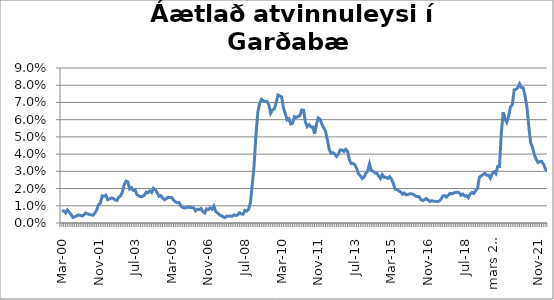
| Category | Series 0 |
|---|---|
| mar.00 | 0.007 |
| apr.00 | 0.007 |
| maí.00 | 0.006 |
| jún.00 | 0.008 |
| júl.00 | 0.006 |
| ágú.00 | 0.005 |
| sep.00 | 0.003 |
| okt.00 | 0.004 |
| nóv.00 | 0.004 |
| des.00 | 0.005 |
| jan.01 | 0.004 |
| feb.01 | 0.004 |
| mar.01 | 0.005 |
| apr.01 | 0.006 |
| maí.01 | 0.005 |
| jún.01 | 0.005 |
| júl.01 | 0.005 |
| ágú.01 | 0.005 |
| sep.01 | 0.006 |
| okt.01 | 0.008 |
| nóv.01 | 0.011 |
| des.01 | 0.011 |
| jan.02 | 0.016 |
| feb.02 | 0.016 |
| mar.02 | 0.016 |
| apr.02 | 0.013 |
| maí.02 | 0.014 |
| jún.02 | 0.015 |
| júl.02 | 0.014 |
| ágú.02 | 0.013 |
| sep.02 | 0.013 |
| okt.02 | 0.015 |
| nóv.02 | 0.016 |
| des.02 | 0.018 |
| jan.03 | 0.022 |
| feb.03 | 0.024 |
| mar.03 | 0.024 |
| apr.03 | 0.02 |
| maí.03 | 0.021 |
| jún.03 | 0.019 |
| júl.03 | 0.019 |
| ágú.03 | 0.016 |
| sep.03 | 0.016 |
| okt.03 | 0.015 |
| nóv.03 | 0.015 |
| des.03 | 0.016 |
| jan.04 | 0.018 |
| feb.04 | 0.017 |
| mar.04 | 0.019 |
| apr.04 | 0.018 |
| maí.04 | 0.02 |
| jún.04 | 0.019 |
| júl.04 | 0.018 |
| ágú.04 | 0.016 |
| sep.04 | 0.016 |
| okt.04 | 0.015 |
| nóv.04 | 0.014 |
| des.04 | 0.014 |
| jan.05 | 0.015 |
| feb.05 | 0.015 |
| mar.05 | 0.015 |
| apr.05 | 0.013 |
| maí.05 | 0.012 |
| jún.05 | 0.012 |
| júl.05 | 0.012 |
| ágú.05 | 0.01 |
| sep.05 | 0.009 |
| okt.05 | 0.009 |
| nóv.05 | 0.009 |
| des.05 | 0.009 |
| jan.06 | 0.009 |
| feb.06 | 0.009 |
| mar.06 | 0.009 |
| apr.06 | 0.007 |
| maí.06 | 0.008 |
| jún.06 | 0.008 |
| júl.06 | 0.008 |
| ágú.06 | 0.007 |
| sep.06 | 0.006 |
| okt.06 | 0.008 |
| nóv.06 | 0.008 |
| des.06 | 0.009 |
| jan.07 | 0.008 |
| feb.07 | 0.01 |
| mar.07 | 0.007 |
| apr.07 | 0.006 |
| maí.07 | 0.005 |
| jún.07 | 0.004 |
| júl.07 | 0.004 |
| ágú.07 | 0.003 |
| sep.07 | 0.004 |
| okt.07 | 0.004 |
| nóv.07 | 0.004 |
| des.07 | 0.004 |
| jan.08 | 0.005 |
| feb.08 | 0.004 |
| mar.08 | 0.005 |
| apr.08 | 0.006 |
| maí.08 | 0.005 |
| jún.08 | 0.005 |
| júl.08 | 0.007 |
| ágú.08 | 0.007 |
| sep.08 | 0.008 |
| okt.08 | 0.012 |
| nóv.08 | 0.023 |
| des.08 | 0.034 |
| jan.09 | 0.051 |
| feb.09 | 0.064 |
| mar.09 | 0.069 |
| apr.09 | 0.072 |
| maí.09 | 0.071 |
| jún.09 | 0.07 |
| júl.09 | 0.071 |
| ágú.09 | 0.069 |
| sep.09 | 0.064 |
| okt.09 | 0.066 |
| nóv.09 | 0.066 |
| des.09 | 0.07 |
| jan.10 | 0.074 |
| feb.10 | 0.074 |
| mar.10 | 0.073 |
| apr.10 | 0.067 |
| maí.10 | 0.064 |
| jún.10 | 0.06 |
| júl.10 | 0.061 |
| ágú.10 | 0.058 |
| sep.10 | 0.058 |
| okt.10 | 0.062 |
| nóv.10 | 0.061 |
| des.10 | 0.062 |
| jan.11 | 0.062 |
| feb.11 | 0.066 |
| mar.11 | 0.065 |
| apr.11 | 0.059 |
| maí.11 | 0.056 |
| jún.11 | 0.057 |
| júl.11 | 0.056 |
| ágú.11 | 0.056 |
| sep.11 | 0.052 |
| okt.11 | 0.057 |
| nóv.11 | 0.061 |
| des.11 | 0.06 |
| jan.12 | 0.057 |
| feb.12 | 0.055 |
| mar.12 | 0.053 |
| apr.12 | 0.048 |
| maí.12 | 0.043 |
| jún.12 | 0.04 |
| júl.12 | 0.041 |
| ágú.12 | 0.04 |
| sep.12 | 0.039 |
| okt.12 | 0.04 |
| nóv.12 | 0.042 |
| des.12 | 0.042 |
| jan.2013* | 0.042 |
| feb.13 | 0.043 |
| mar.13 | 0.042 |
| apr.13 | 0.037 |
| maí.13 | 0.035 |
| jún.13 | 0.035 |
| júl.13 | 0.034 |
| ágú.13 | 0.032 |
| sep.13 | 0.029 |
| okt.13 | 0.027 |
| nóv.13 | 0.026 |
| des.13 | 0.027 |
| jan.14 | 0.029 |
| feb.14 | 0.03 |
| mar.14 | 0.034 |
| apr.14 | 0.031 |
| maí.14 | 0.03 |
| jún.14 | 0.029 |
| júl.14 | 0.029 |
| ágú.14 | 0.027 |
| sep.14 | 0.026 |
| okt.14 | 0.028 |
| nóv.14 | 0.027 |
| des.14 | 0.027 |
| jan.15 | 0.026 |
| feb.15 | 0.027 |
| mar.15 | 0.026 |
| apr.15 | 0.023 |
| maí.15 | 0.02 |
| jún.15 | 0.019 |
| júl.15 | 0.019 |
| ágú.15 | 0.018 |
| sep.15 | 0.017 |
| okt.15 | 0.017 |
| nóv.15 | 0.016 |
| des.15 | 0.017 |
| jan.16 | 0.017 |
| feb.16 | 0.017 |
| mar.16 | 0.017 |
| apr.16 | 0.016 |
| maí.16 | 0.015 |
| jún.16 | 0.015 |
| júl.16 | 0.014 |
| ágú.16 | 0.013 |
| sep.16 | 0.013 |
| okt.16 | 0.014 |
| nóv.16 | 0.013 |
| des.16 | 0.012 |
| jan.17 | 0.013 |
| feb.17 | 0.013 |
| mar.17 | 0.013 |
| apr.17 | 0.012 |
| maí.17 | 0.013 |
| jún.17 | 0.014 |
| júl.17 | 0.016 |
| ágú.17 | 0.016 |
| sep.17 | 0.015 |
| okt.17 | 0.016 |
| nóv.17 | 0.017 |
| des.17 | 0.017 |
| jan.18 | 0.017 |
| feb.18 | 0.018 |
| mar.18 | 0.018 |
| apr.18 | 0.018 |
| maí.18 | 0.016 |
| jún.18 | 0.017 |
| júl.18 | 0.016 |
| ágú.18 | 0.016 |
| sep.18 | 0.015 |
| okt.18 | 0.017 |
| nóv.18 | 0.018 |
| des.18 | 0.017 |
| jan.19 | 0.019 |
| feb.19 | 0.02 |
| mar.19 | 0.027 |
| apr.19 | 0.027 |
| maí.19 | 0.028 |
| jún.19 | 0.029 |
| júl.19 | 0.028 |
| ágú.19 | 0.028 |
| sep.19 | 0.026 |
| okt.19 | 0.029 |
| nóv.19 | 0.03 |
| des.19 | 0.029 |
| jan.20 | 0.033 |
| feb.20 | 0.033 |
| mars 2020*** | 0.052 |
| apr.20 | 0.064 |
| maí.20 | 0.061 |
| jún.20 | 0.058 |
| júl.20 | 0.062 |
| ágú.20 | 0.067 |
| sep.20 | 0.069 |
| okt.20 | 0.077 |
| nóv.20 | 0.078 |
| des.20 | 0.079 |
| jan.21 | 0.081 |
| feb.21 | 0.079 |
| mar.21 | 0.078 |
| apr.21 | 0.074 |
| maí.21 | 0.068 |
| jún.21 | 0.056 |
| júl.21 | 0.047 |
| ágú.21 | 0.044 |
| sep.21 | 0.04 |
| okt.21 | 0.037 |
| nóv.21 | 0.035 |
| des.21 | 0.036 |
| jan.22 | 0.036 |
| feb.22 | 0.034 |
| mar.22 | 0.032 |
| apr.22 | 0.03 |